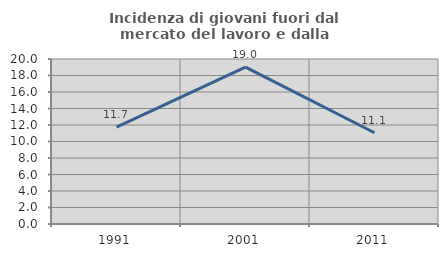
| Category | Incidenza di giovani fuori dal mercato del lavoro e dalla formazione  |
|---|---|
| 1991.0 | 11.73 |
| 2001.0 | 19.021 |
| 2011.0 | 11.063 |